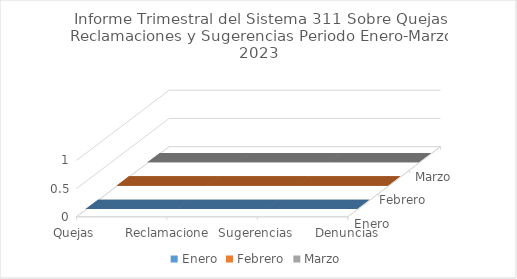
| Category | Enero | Febrero | Marzo |
|---|---|---|---|
| Quejas | 0 | 0 | 0 |
| Reclamaciones | 0 | 0 | 0 |
| Sugerencias | 0 | 0 | 0 |
| Denuncias | 0 | 0 | 0 |